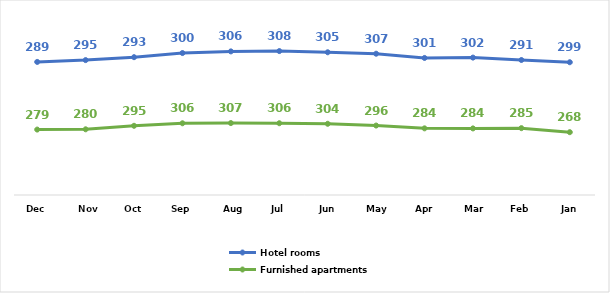
| Category | Furnished apartments | Hotel rooms |
|---|---|---|
| Jan | 268.11 | 298.561 |
| Feb | 285.307 | 290.92 |
| Mar | 284.175 | 302.31 |
| Apr | 284.477 | 300.502 |
| May | 296.468 | 306.55 |
| Jun | 303.978 | 305.251 |
| Jul | 306.323 | 307.99 |
| Aug | 307.037 | 305.934 |
| Sep | 306.089 | 299.802 |
| Oct | 295.38 | 292.865 |
| Nov | 280.428 | 295.356 |
| Dec | 279.292 | 288.731 |